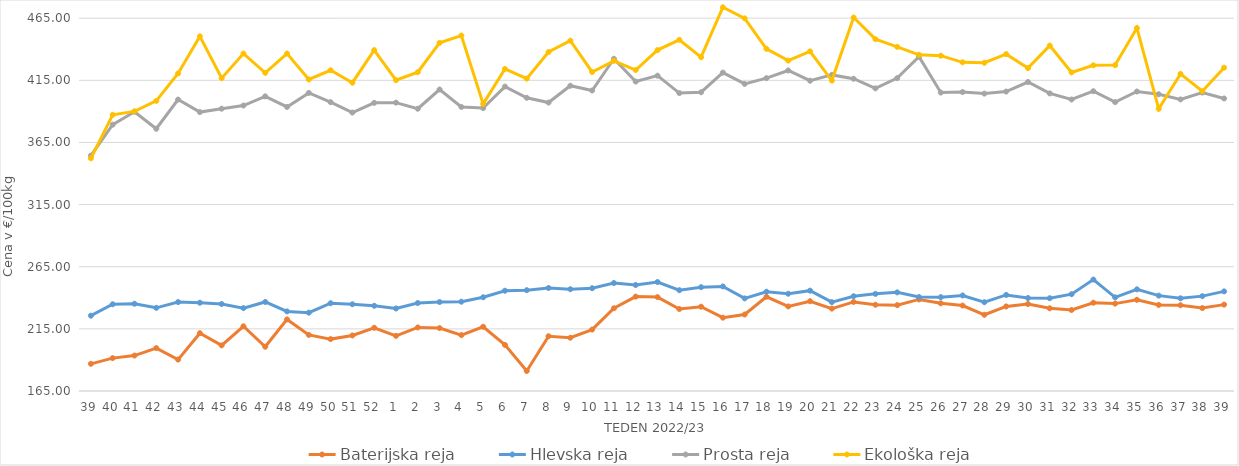
| Category | Baterijska reja | Hlevska reja | Prosta reja | Ekološka reja |
|---|---|---|---|---|
| 39.0 | 186.86 | 225.6 | 354.41 | 352.24 |
| 40.0 | 191.45 | 234.79 | 379.35 | 387.24 |
| 41.0 | 193.52 | 235.24 | 389.75 | 390 |
| 42.0 | 199.51 | 231.92 | 376.02 | 398.45 |
| 43.0 | 190.28 | 236.56 | 399.51 | 420.52 |
| 44.0 | 211.53 | 236.04 | 389.44 | 450.35 |
| 45.0 | 201.69 | 235.01 | 392.15 | 416.72 |
| 46.0 | 217.08 | 231.68 | 394.71 | 436.55 |
| 47.0 | 200.62 | 236.65 | 402.12 | 421.03 |
| 48.0 | 222.61 | 229.05 | 393.56 | 436.55 |
| 49.0 | 210.16 | 228.03 | 404.87 | 415.69 |
| 50.0 | 206.76 | 235.63 | 397.4 | 423.1 |
| 51.0 | 209.69 | 234.79 | 389.05 | 413.1 |
| 52.0 | 215.87 | 233.58 | 396.87 | 439.31 |
| 1.0 | 209.37 | 231.41 | 397.04 | 415.17 |
| 2.0 | 216.15 | 235.78 | 392.13 | 421.55 |
| 3.0 | 215.63 | 236.58 | 407.61 | 445.17 |
| 4.0 | 210 | 236.85 | 393.58 | 451.04 |
| 5.0 | 216.7 | 240.42 | 392.67 | 396.03 |
| 6.0 | 202.1 | 245.67 | 409.97 | 424.14 |
| 7.0 | 181.11 | 246.12 | 400.94 | 416.38 |
| 8.0 | 209.08 | 247.88 | 397.11 | 437.76 |
| 9.0 | 207.87 | 246.89 | 410.64 | 446.9 |
| 10.0 | 214.42 | 247.73 | 406.8 | 421.72 |
| 11.0 | 231.56 | 251.88 | 432.34 | 430.69 |
| 12.0 | 240.97 | 250.3 | 414 | 423.28 |
| 13.0 | 240.55 | 252.7 | 418.74 | 439.31 |
| 14.0 | 230.99 | 246.12 | 404.72 | 447.59 |
| 15.0 | 232.82 | 248.56 | 405.42 | 433.62 |
| 16.0 | 224 | 249.17 | 421.22 | 473.79 |
| 17.0 | 226.57 | 239.5 | 412.13 | 464.83 |
| 18.0 | 240.83 | 244.89 | 416.74 | 440.35 |
| 19.0 | 233.05 | 243.26 | 422.93 | 430.86 |
| 20.0 | 237.25 | 245.73 | 414.68 | 438.28 |
| 21.0 | 231.3 | 236.5 | 419.36 | 414.83 |
| 22.0 | 236.67 | 241.27 | 416.27 | 465.52 |
| 23.0 | 234.39 | 243.16 | 408.53 | 448.1 |
| 24.0 | 234.08 | 244.37 | 416.78 | 441.9 |
| 25.0 | 238.69 | 240.6 | 434.05 | 435.52 |
| 26.0 | 235.57 | 240.51 | 405.15 | 434.83 |
| 27.0 | 233.75 | 241.89 | 405.58 | 429.48 |
| 28.0 | 226.35 | 236.46 | 404.32 | 429.14 |
| 29.0 | 233.03 | 242.31 | 405.96 | 436.04 |
| 30.0 | 235 | 239.8 | 413.63 | 424.83 |
| 31.0 | 231.55 | 239.67 | 404.46 | 442.93 |
| 32.0 | 230.2 | 242.89 | 399.57 | 421.38 |
| 33.0 | 236.04 | 254.68 | 406.23 | 427.07 |
| 34.0 | 235.32 | 240.35 | 397.45 | 427.24 |
| 35.0 | 238.39 | 246.82 | 406 | 457.07 |
| 36.0 | 234.27 | 241.75 | 403.79 | 392.07 |
| 37.0 | 234 | 239.58 | 399.61 | 420.17 |
| 38.0 | 231.74 | 241.34 | 405.14 | 406.21 |
| 39.0 | 234.5 | 245.15 | 400.39 | 425.17 |